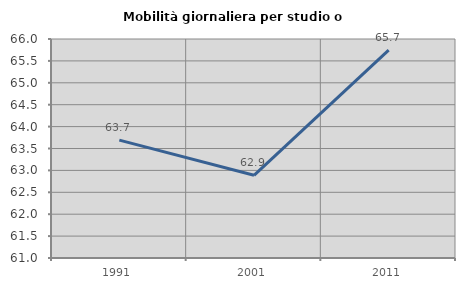
| Category | Mobilità giornaliera per studio o lavoro |
|---|---|
| 1991.0 | 63.691 |
| 2001.0 | 62.888 |
| 2011.0 | 65.747 |